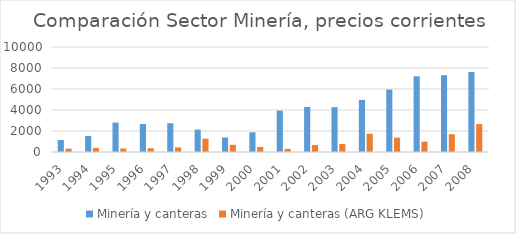
| Category | Minería y canteras | Minería y canteras (ARG KLEMS) |
|---|---|---|
| 1993.0 | 1150.442 | 316.059 |
| 1994.0 | 1534.709 | 386.261 |
| 1995.0 | 2801.669 | 335.489 |
| 1996.0 | 2664.422 | 356.769 |
| 1997.0 | 2740.533 | 441.778 |
| 1998.0 | 2136.619 | 1268.858 |
| 1999.0 | 1384.022 | 687.051 |
| 2000.0 | 1881.067 | 481.408 |
| 2001.0 | 3943.108 | 300.546 |
| 2002.0 | 4292.703 | 658.963 |
| 2003.0 | 4271.106 | 761.559 |
| 2004.0 | 4962.57 | 1742.164 |
| 2005.0 | 5945.638 | 1365.839 |
| 2006.0 | 7207.75 | 982.131 |
| 2007.0 | 7313.104 | 1688.507 |
| 2008.0 | 7624.301 | 2659.006 |